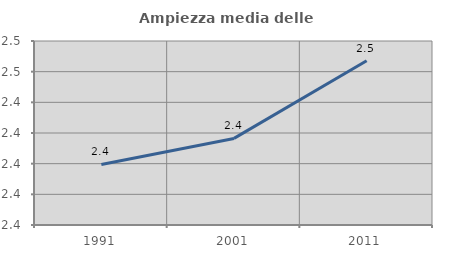
| Category | Ampiezza media delle famiglie |
|---|---|
| 1991.0 | 2.4 |
| 2001.0 | 2.416 |
| 2011.0 | 2.467 |